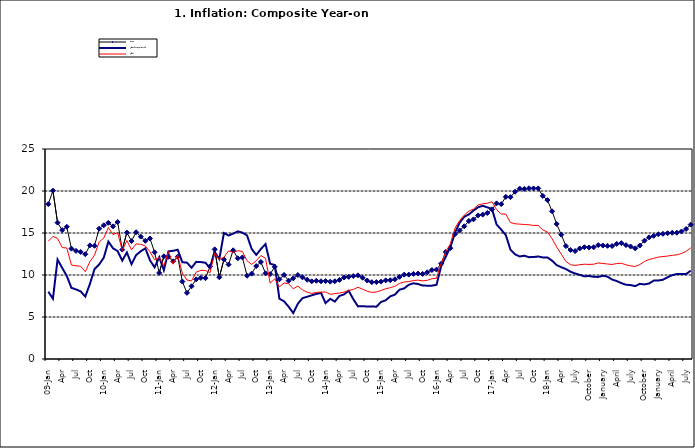
| Category | Food | All Items less Farm Produce | All Items |
|---|---|---|---|
| 09-Jan | 18.436 | 8.013 | 14.034 |
| Feb | 20.041 | 7.178 | 14.584 |
| Mar | 16.233 | 11.842 | 14.366 |
| Apr | 15.342 | 10.85 | 13.268 |
| May | 15.74 | 9.88 | 13.212 |
| June | 13.138 | 8.472 | 11.194 |
| Jul | 12.867 | 8.285 | 11.09 |
| Aug | 12.746 | 8.044 | 11.046 |
| Sep | 12.472 | 7.431 | 10.39 |
| Oct | 13.524 | 8.933 | 11.588 |
| Nov | 13.482 | 10.702 | 12.368 |
| Dec | 15.518 | 11.249 | 13.93 |
| 10-Jan | 15.918 | 12.063 | 14.398 |
| Feb | 16.208 | 13.978 | 15.649 |
| Mar | 15.79 | 13.184 | 14.812 |
| Apr | 16.306 | 12.844 | 15.044 |
| May | 13.023 | 11.711 | 12.915 |
| Jun | 15.053 | 12.686 | 14.099 |
| Jul | 14.043 | 11.287 | 13.002 |
| Aug | 15.09 | 12.366 | 13.702 |
| Sep | 14.57 | 12.83 | 13.65 |
| Oct | 14.065 | 13.168 | 13.45 |
| Nov | 14.351 | 11.746 | 12.766 |
| Dec | 12.701 | 10.917 | 11.815 |
| 11-Jan | 10.255 | 12.118 | 12.08 |
| Feb | 12.221 | 10.569 | 11.1 |
| Mar | 12.169 | 12.815 | 12.779 |
| Apr | 11.629 | 12.882 | 11.291 |
| May | 12.179 | 13.006 | 12.352 |
| Jun | 9.22 | 11.524 | 10.23 |
| Jul | 7.877 | 11.472 | 9.397 |
| Aug | 8.665 | 10.863 | 9.301 |
| Sep | 9.479 | 11.567 | 10.339 |
| Oct | 9.656 | 11.539 | 10.544 |
| Nov | 9.623 | 11.459 | 10.54 |
| Dec | 11.02 | 10.822 | 10.283 |
| 12-Jan | 13.053 | 12.748 | 12.626 |
| 12-Feb | 9.729 | 11.901 | 11.866 |
| 12-Mar | 11.848 | 14.995 | 12.111 |
| Apr | 11.246 | 14.703 | 12.866 |
| May | 12.942 | 14.926 | 12.688 |
| Jun | 11.991 | 15.199 | 12.892 |
| Jul | 12.093 | 15.045 | 12.797 |
| Aug | 9.91 | 14.714 | 11.689 |
| Sep | 10.164 | 13.101 | 11.253 |
| Oct | 11.064 | 12.398 | 11.693 |
| Nov | 11.553 | 13.092 | 12.32 |
| Dec | 10.199 | 13.685 | 11.981 |
| 13-Jan | 10.106 | 11.342 | 9.031 |
| Feb | 10.973 | 11.184 | 9.542 |
| Mar | 9.482 | 7.179 | 8.593 |
| Apr | 10.006 | 6.874 | 9.052 |
| May | 9.321 | 6.227 | 8.964 |
| Jun | 9.606 | 5.472 | 8.353 |
| Jul | 9.994 | 6.58 | 8.682 |
| Aug | 9.723 | 7.245 | 8.231 |
| Sep | 9.437 | 7.41 | 7.952 |
| Oct | 9.249 | 7.579 | 7.807 |
| Nov | 9.313 | 7.75 | 7.931 |
| Dec | 9.253 | 7.872 | 7.957 |
| 14-Jan | 9.271 | 6.648 | 7.977 |
| Feb | 9.207 | 7.166 | 7.707 |
| Mar | 9.254 | 6.836 | 7.783 |
| Apr | 9.414 | 7.508 | 7.851 |
| May | 9.698 | 7.693 | 7.965 |
| Jun | 9.776 | 8.122 | 8.167 |
| Jul | 9.878 | 7.116 | 8.281 |
| Aug | 9.959 | 6.264 | 8.534 |
| Sep | 9.676 | 6.278 | 8.317 |
| Oct | 9.343 | 6.252 | 8.06 |
| Nov | 9.144 | 6.255 | 7.927 |
| Dec | 9.152 | 6.225 | 7.978 |
| 15-Jan | 9.215 | 6.787 | 8.157 |
| Feb | 9.359 | 6.994 | 8.359 |
| Mar | 9.376 | 7.46 | 8.494 |
| Apr | 9.49 | 7.661 | 8.655 |
| May | 9.782 | 8.253 | 9.003 |
| Jun | 10.041 | 8.403 | 9.168 |
| Jul | 10.049 | 8.83 | 9.218 |
| Aug | 10.131 | 9.01 | 9.336 |
| Sep | 10.174 | 8.928 | 9.394 |
| Oct | 10.129 | 8.742 | 9.296 |
| Nov | 10.321 | 8.732 | 9.368 |
| Dec | 10.588 | 8.727 | 9.554 |
| 16-Jan | 10.642 | 8.841 | 9.617 |
| Feb | 11.348 | 11.041 | 11.379 |
| Mar | 12.745 | 12.17 | 12.775 |
| Apr | 13.194 | 13.352 | 13.721 |
| May | 14.861 | 15.054 | 15.577 |
| Jun | 15.302 | 16.224 | 16.48 |
| Jul | 15.799 | 16.929 | 17.127 |
| Aug | 16.427 | 17.208 | 17.609 |
| Sep | 16.622 | 17.666 | 17.852 |
| Oct | 17.09 | 18.067 | 18.33 |
| Nov | 17.191 | 18.241 | 18.476 |
| Dec | 17.388 | 18.052 | 18.547 |
| 17-Jan | 17.818 | 17.867 | 18.719 |
| Feb | 18.528 | 16.011 | 17.78 |
| Mar | 18.436 | 15.404 | 17.256 |
| Apr | 19.303 | 14.75 | 17.244 |
| May | 19.266 | 13.016 | 16.251 |
| Jun | 19.915 | 12.455 | 16.098 |
| Jul | 20.284 | 12.207 | 16.053 |
| Aug | 20.251 | 12.296 | 16.012 |
| Sep | 20.321 | 12.123 | 15.979 |
| Oct | 20.306 | 12.142 | 15.905 |
| Nov | 20.308 | 12.206 | 15.901 |
| Dec | 19.415 | 12.089 | 15.372 |
| 18-Jan | 18.919 | 12.09 | 15.127 |
| Feb | 17.588 | 11.707 | 14.33 |
| Mar | 16.08 | 11.181 | 13.337 |
| Apr | 14.799 | 10.92 | 12.482 |
| May | 13.448 | 10.71 | 11.608 |
| June | 12.977 | 10.387 | 11.231 |
| July | 12.85 | 10.183 | 11.142 |
| August | 13.158 | 10.015 | 11.227 |
| September | 13.309 | 9.838 | 11.284 |
| October | 13.277 | 9.882 | 11.259 |
| November | 13.301 | 9.787 | 11.281 |
| December | 13.559 | 9.771 | 11.442 |
| January | 13.505 | 9.91 | 11.374 |
| February | 13.473 | 9.8 | 11.306 |
| March | 13.451 | 9.461 | 11.251 |
| April | 13.701 | 9.28 | 11.372 |
| May | 13.794 | 9.033 | 11.396 |
| June | 13.558 | 8.841 | 11.217 |
| July | 13.392 | 8.798 | 11.084 |
| August | 13.17 | 8.678 | 11.016 |
| September | 13.507 | 8.945 | 11.244 |
| October | 14.088 | 8.876 | 11.607 |
| November | 14.482 | 8.993 | 11.854 |
| December | 14.667 | 9.331 | 11.982 |
| January | 14.849 | 9.349 | 12.132 |
| February | 14.904 | 9.434 | 12.199 |
| March | 14.977 | 9.732 | 12.257 |
| April | 15.026 | 9.979 | 12.341 |
| May | 15.036 | 10.12 | 12.404 |
| June | 15.175 | 10.128 | 12.559 |
| July | 15.482 | 10.102 | 12.821 |
| August | 15.996 | 10.521 | 13.22 |